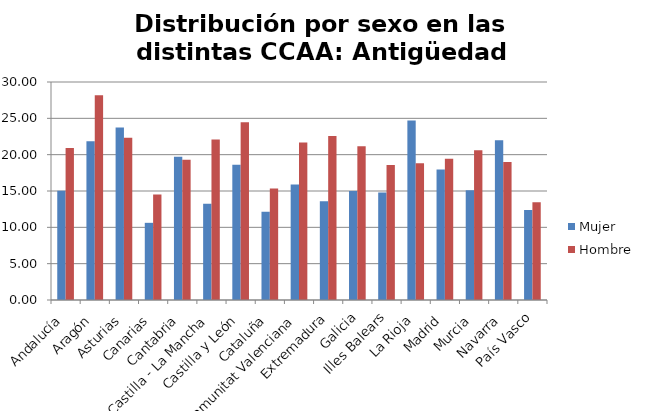
| Category | Mujer | Hombre |
|---|---|---|
| Andalucía | 15.04 | 20.92 |
| Aragón | 21.85 | 28.17 |
| Asturias | 23.73 | 22.32 |
| Canarias | 10.62 | 14.52 |
| Cantabria | 19.71 | 19.3 |
| Castilla - La Mancha | 13.25 | 22.1 |
| Castilla y León | 18.61 | 24.46 |
| Cataluña | 12.16 | 15.34 |
| Comunitat Valenciana | 15.91 | 21.67 |
| Extremadura | 13.59 | 22.57 |
| Galicia | 15 | 21.15 |
| Illes Balears | 14.81 | 18.59 |
| La Rioja | 24.71 | 18.83 |
| Madrid | 17.95 | 19.44 |
| Murcia | 15.11 | 20.6 |
| Navarra | 22 | 19 |
| País Vasco | 12.4 | 13.45 |